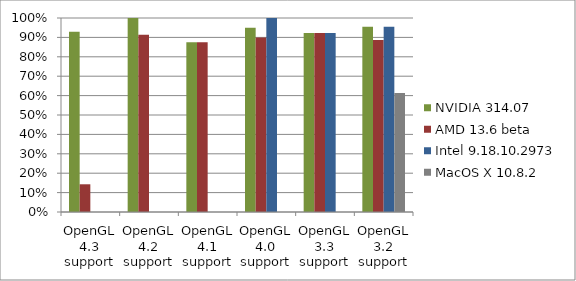
| Category | NVIDIA 314.07 | AMD 13.6 beta | Intel 9.18.10.2973 | MacOS X 10.8.2 |
|---|---|---|---|---|
| OpenGL 4.3 support | 0.929 | 0.143 | 0 | 0 |
| OpenGL 4.2 support | 1 | 0.913 | 0 | 0 |
| OpenGL 4.1 support | 0.875 | 0.875 | 0 | 0 |
| OpenGL 4.0 support | 0.95 | 0.9 | 1 | 0 |
| OpenGL 3.3 support | 0.923 | 0.923 | 0.923 | 0 |
| OpenGL 3.2 support | 0.955 | 0.886 | 0.955 | 0.614 |